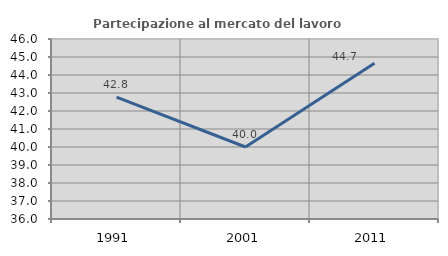
| Category | Partecipazione al mercato del lavoro  femminile |
|---|---|
| 1991.0 | 42.767 |
| 2001.0 | 40 |
| 2011.0 | 44.654 |